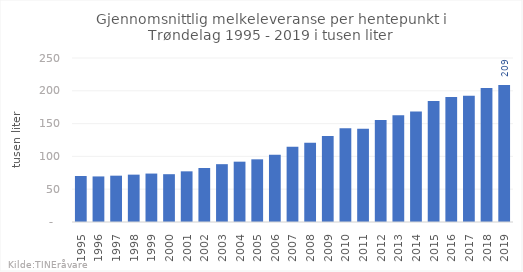
| Category | Totalt |
|---|---|
| 1995 | 70.097 |
| 1996 | 69.466 |
| 1997 | 70.615 |
| 1998 | 72.193 |
| 1999 | 73.844 |
| 2000 | 72.874 |
| 2001 | 77.243 |
| 2002 | 82.331 |
| 2003 | 88.159 |
| 2004 | 91.962 |
| 2005 | 95.549 |
| 2006 | 102.409 |
| 2007 | 114.677 |
| 2008 | 120.73 |
| 2009 | 131.049 |
| 2010 | 142.965 |
| 2011 | 142.278 |
| 2012 | 155.641 |
| 2013 | 162.792 |
| 2014 | 168.587 |
| 2015 | 184.439 |
| 2016 | 190.668 |
| 2017 | 192.455 |
| 2018 | 204.269 |
| 2019 | 208.914 |